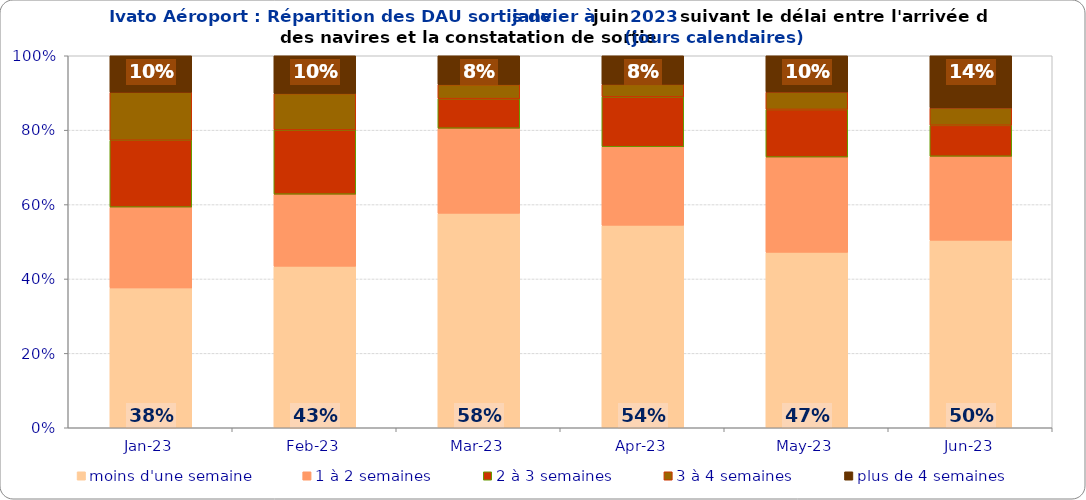
| Category | moins d'une semaine | 1 à 2 semaines | 2 à 3 semaines | 3 à 4 semaines | plus de 4 semaines |
|---|---|---|---|---|---|
| 2023-01-01 | 0.376 | 0.217 | 0.18 | 0.129 | 0.098 |
| 2023-02-01 | 0.434 | 0.194 | 0.173 | 0.098 | 0.102 |
| 2023-03-01 | 0.577 | 0.229 | 0.08 | 0.038 | 0.078 |
| 2023-04-01 | 0.544 | 0.211 | 0.134 | 0.034 | 0.077 |
| 2023-05-01 | 0.472 | 0.256 | 0.128 | 0.047 | 0.098 |
| 2023-06-01 | 0.504 | 0.226 | 0.083 | 0.047 | 0.14 |